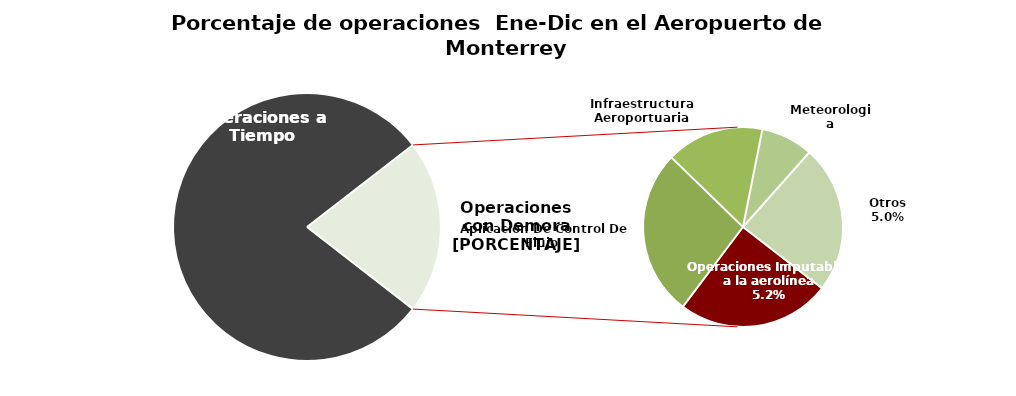
| Category | Series 0 |
|---|---|
| Operaciones a Tiempo | 46474 |
| Operaciones Imputables a la aerolínea | 3059 |
| Aplicación De Control De Flujo  | 3331 |
| Infraestructura Aeroportuaria | 1956 |
| Meteorologia | 1043 |
| Otros | 2952 |